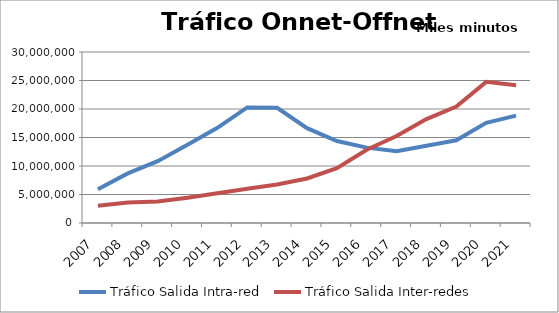
| Category | Tráfico Salida Intra-red | Tráfico Salida Inter-redes |
|---|---|---|
| 2007.0 | 5904083.795 | 3007133.407 |
| 2008.0 | 8700474.341 | 3605725.198 |
| 2009.0 | 10848127.978 | 3777186.553 |
| 2010.0 | 13731169.756 | 4442212.593 |
| 2011.0 | 16701623.385 | 5230021.942 |
| 2012.0 | 20281369.71 | 6022295.52 |
| 2013.0 | 20221752.311 | 6753941.544 |
| 2014.0 | 16638252.145 | 7814497.129 |
| 2015.0 | 14381121.54 | 9633316.484 |
| 2016.0 | 13225230.314 | 12856929.179 |
| 2017.0 | 12578132.761 | 15268259.097 |
| 2018.0 | 13561366.511 | 18231708.333 |
| 2019.0 | 14512688.723 | 20417632.119 |
| 2020.0 | 17565224.615 | 24757362.175 |
| 2021.0 | 18837306.111 | 24154210.318 |